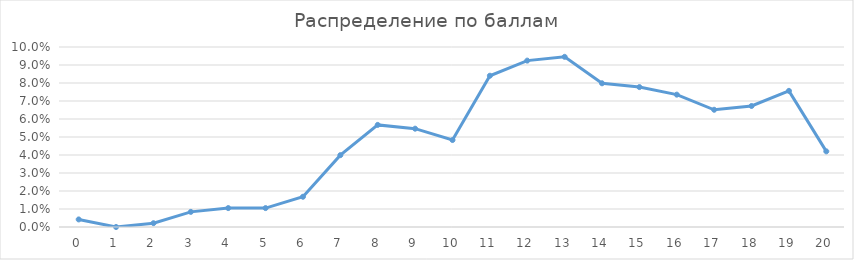
| Category | Series 0 |
|---|---|
| 0.0 | 0.004 |
| 1.0 | 0 |
| 2.0 | 0.002 |
| 3.0 | 0.008 |
| 4.0 | 0.011 |
| 5.0 | 0.011 |
| 6.0 | 0.017 |
| 7.0 | 0.04 |
| 8.0 | 0.057 |
| 9.0 | 0.055 |
| 10.0 | 0.048 |
| 11.0 | 0.084 |
| 12.0 | 0.092 |
| 13.0 | 0.095 |
| 14.0 | 0.08 |
| 15.0 | 0.078 |
| 16.0 | 0.074 |
| 17.0 | 0.065 |
| 18.0 | 0.067 |
| 19.0 | 0.076 |
| 20.0 | 0.042 |